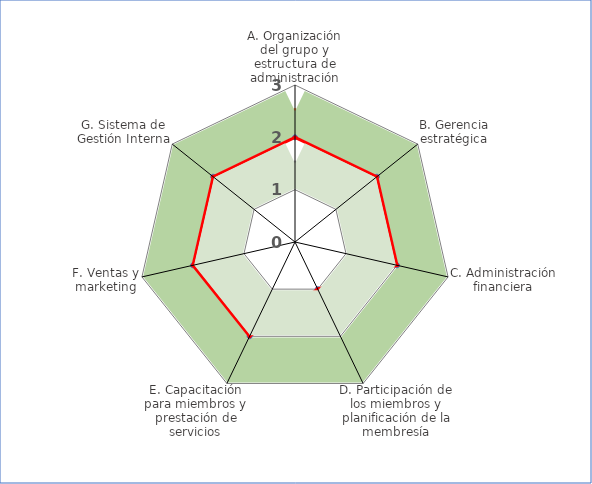
| Category | Series 1 | Series 0 | Series 2 |
|---|---|---|---|
| A. Organización del grupo y estructura de administración | 2.5 | 2 | 1.5 |
| B. Gerencia estratégica | 2.5 | 2 | 1.5 |
| C. Administración financiera | 2.5 | 2 | 1.5 |
| D. Participación de los miembros y planificación de la membresía | 2.5 | 1 | 1.5 |
| E. Capacitación para miembros y prestación de servicios | 2.5 | 2 | 1.5 |
| F. Ventas y marketing | 2.5 | 2 | 1.5 |
| G. Sistema de Gestión Interna | 2.5 | 2 | 1.5 |